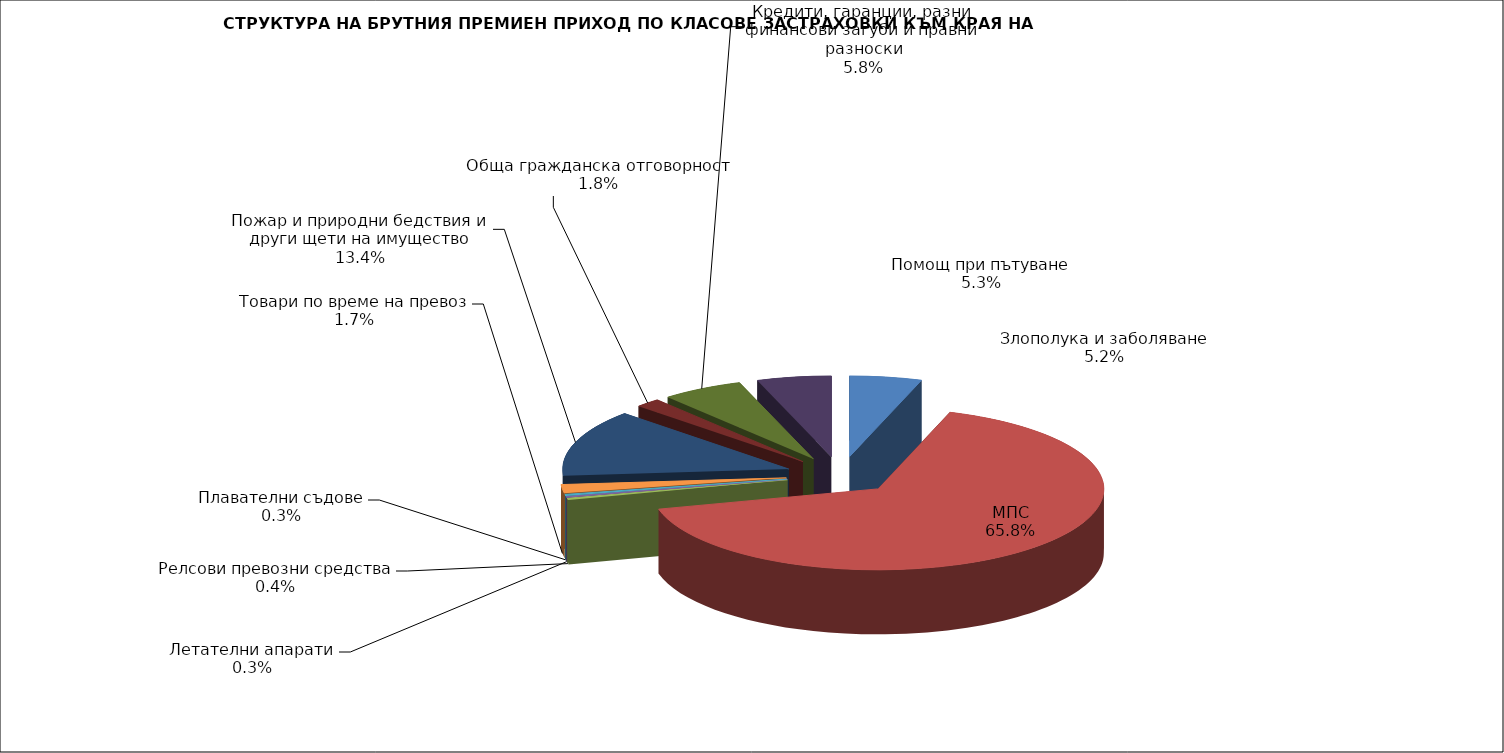
| Category | Злополука и заболяване |
|---|---|
| Злополука и заболяване | 0.052 |
| МПС | 0.658 |
| Релсови превозни средства | 0.004 |
| Летателни апарати | 0.003 |
| Плавателни съдове | 0.003 |
| Товари по време на превоз | 0.017 |
| Пожар и природни бедствия и други щети на имущество | 0.134 |
| Обща гражданска отговорност | 0.018 |
| Кредити, гаранции, разни финансови загуби и правни разноски | 0.058 |
| Помощ при пътуване | 0.053 |